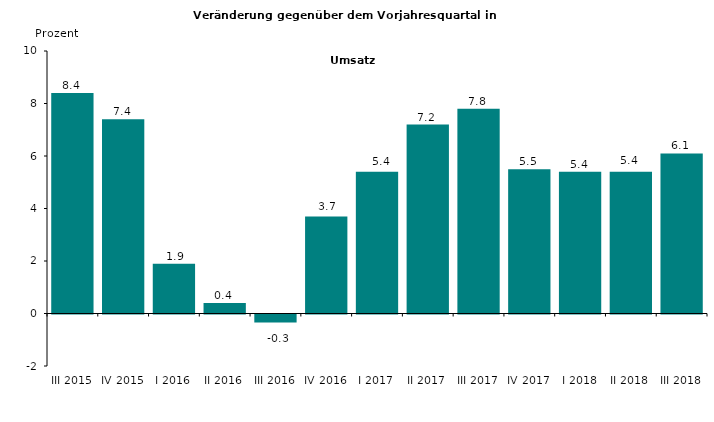
| Category | Series 0 |
|---|---|
| III 2015 | 8.4 |
| IV 2015 | 7.4 |
| I 2016 | 1.9 |
| II 2016 | 0.4 |
| III 2016 | -0.3 |
| IV 2016 | 3.7 |
| I 2017 | 5.4 |
| II 2017 | 7.2 |
| III 2017 | 7.8 |
| IV 2017 | 5.5 |
| I 2018 | 5.4 |
| II 2018 | 5.4 |
| III 2018 | 6.1 |